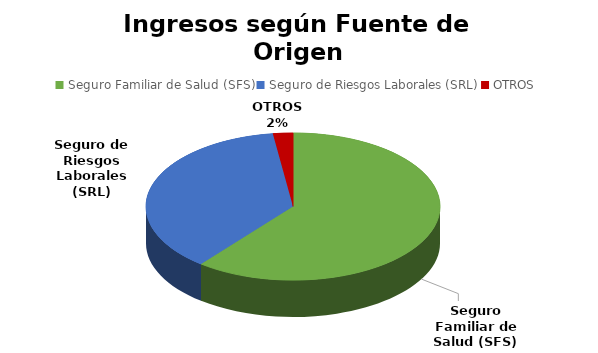
| Category | Series 0 |
|---|---|
| Seguro Familiar de Salud (SFS) | 309874554.55 |
| Seguro de Riesgos Laborales (SRL) | 189049670.59 |
| OTROS | 11159059.43 |